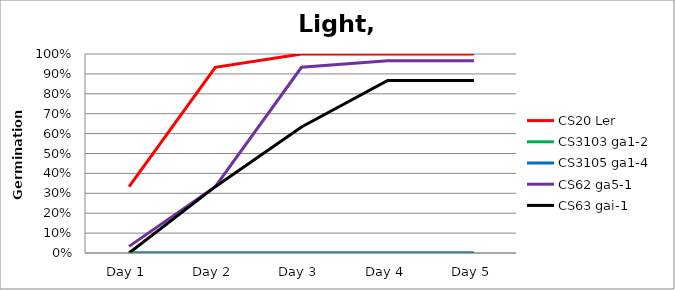
| Category | CS20 Ler | CS3103 ga1-2 | CS3105 ga1-4  | CS62 ga5-1 | CS63 gai-1 |
|---|---|---|---|---|---|
| Day 1 | 0.333 | 0 | 0 | 0.033 | 0 |
| Day 2 | 0.933 | 0 | 0 | 0.333 | 0.333 |
| Day 3 | 1 | 0 | 0 | 0.933 | 0.633 |
| Day 4 | 1 | 0 | 0 | 0.967 | 0.867 |
| Day 5 | 1 | 0 | 0 | 0.967 | 0.867 |